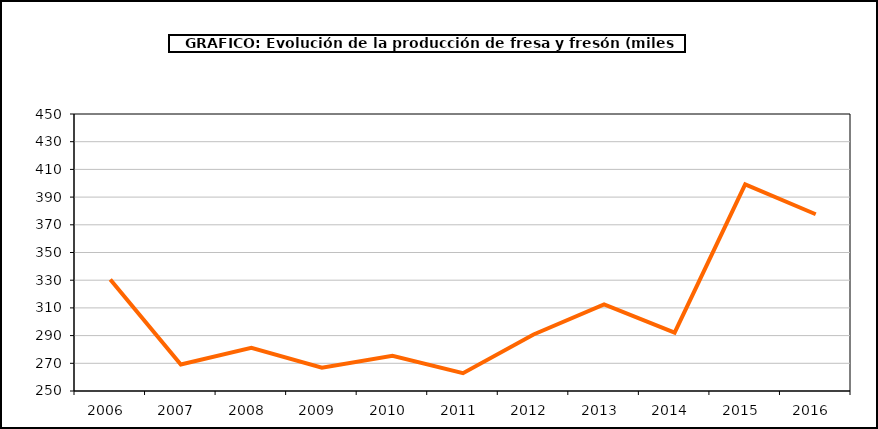
| Category | producción |
|---|---|
| 2006.0 | 330.485 |
| 2007.0 | 269.139 |
| 2008.0 | 281.24 |
| 2009.0 | 266.772 |
| 2010.0 | 275.355 |
| 2011.0 | 262.896 |
| 2012.0 | 290.843 |
| 2013.0 | 312.466 |
| 2014.0 | 292.101 |
| 2015.0 | 399.217 |
| 2016.0 | 377.596 |